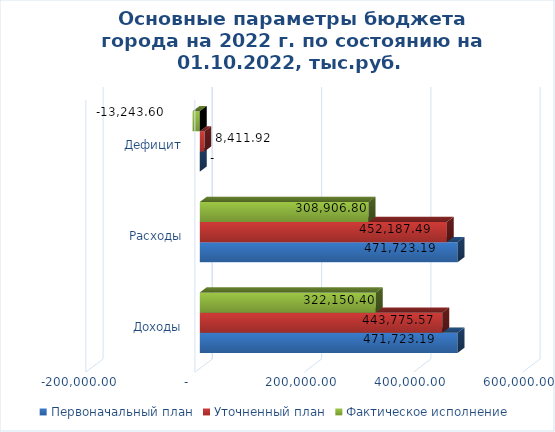
| Category | Первоначальный план | Уточненный план | Фактическое исполнение |
|---|---|---|---|
| Доходы | 471723.19 | 443775.57 | 322150.4 |
| Расходы | 471723.19 | 452187.49 | 308906.8 |
| Дефицит | 0 | 8411.92 | -13243.6 |